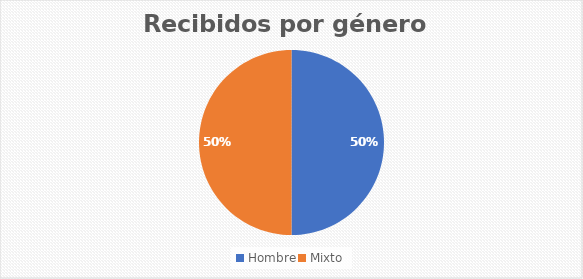
| Category | Recibidos por género  Cantidad |
|---|---|
| Hombre | 3 |
| Mixto | 3 |